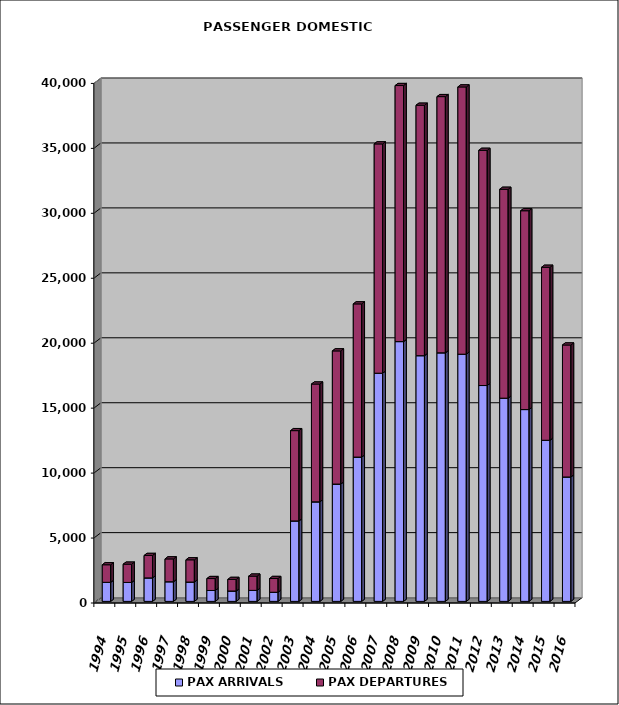
| Category | PAX ARRIVALS | PAX DEPARTURES |
|---|---|---|
| 1994.0 | 1467 | 1352 |
| 1995.0 | 1459 | 1405 |
| 1996.0 | 1807 | 1728 |
| 1997.0 | 1512 | 1758 |
| 1998.0 | 1489 | 1711 |
| 1999.0 | 839 | 918 |
| 2000.0 | 799 | 891 |
| 2001.0 | 847 | 1098 |
| 2002.0 | 702 | 1060 |
| 2003.0 | 6194 | 6950 |
| 2004.0 | 7662 | 9069 |
| 2005.0 | 9032 | 10251 |
| 2006.0 | 11109 | 11793 |
| 2007.0 | 17566 | 17652 |
| 2008.0 | 20000 | 19711 |
| 2009.0 | 18916 | 19279 |
| 2010.0 | 19136 | 19723 |
| 2011.0 | 19029 | 20575 |
| 2012.0 | 16617 | 18107 |
| 2013.0 | 15644 | 16080 |
| 2014.0 | 14767 | 15306 |
| 2015.0 | 12404 | 13316 |
| 2016.0 | 9578 | 10159 |